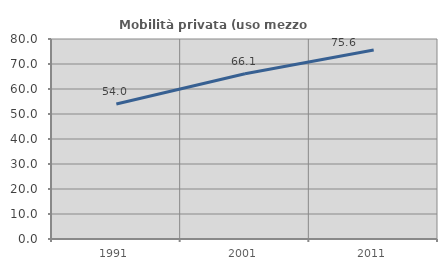
| Category | Mobilità privata (uso mezzo privato) |
|---|---|
| 1991.0 | 54.032 |
| 2001.0 | 66.116 |
| 2011.0 | 75.625 |